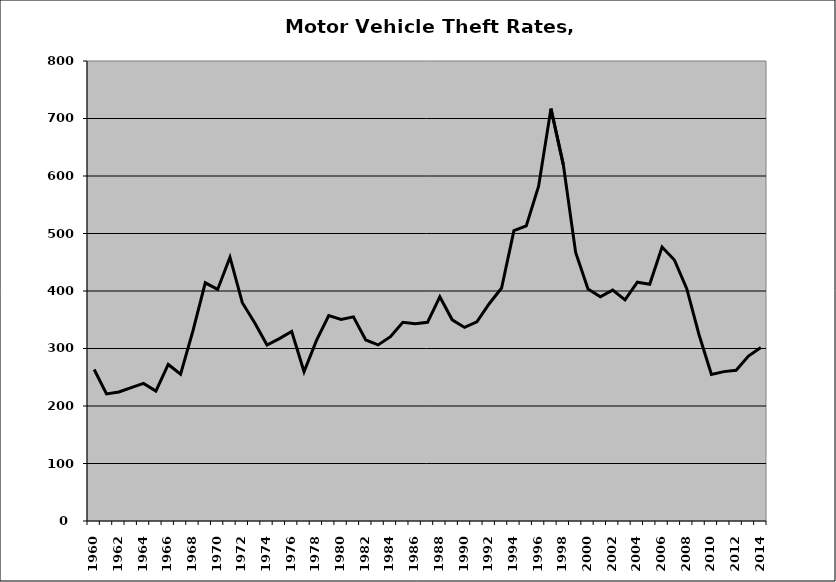
| Category | Motor Vehicle |
|---|---|
| 1960.0 | 263.401 |
| 1961.0 | 220.956 |
| 1962.0 | 224.412 |
| 1963.0 | 232.024 |
| 1964.0 | 239.385 |
| 1965.0 | 225.948 |
| 1966.0 | 272.211 |
| 1967.0 | 255.234 |
| 1968.0 | 330.739 |
| 1969.0 | 414.185 |
| 1970.0 | 402.756 |
| 1971.0 | 458.738 |
| 1972.0 | 379.624 |
| 1973.0 | 344.937 |
| 1974.0 | 306.061 |
| 1975.0 | 317.175 |
| 1976.0 | 329.538 |
| 1977.0 | 259.496 |
| 1978.0 | 313.779 |
| 1979.0 | 357.212 |
| 1980.0 | 350.605 |
| 1981.0 | 355.087 |
| 1982.0 | 314.864 |
| 1983.0 | 306.29 |
| 1984.0 | 320.506 |
| 1985.0 | 345.724 |
| 1986.0 | 343.272 |
| 1987.0 | 345.533 |
| 1988.0 | 389.934 |
| 1989.0 | 349.869 |
| 1990.0 | 336.684 |
| 1991.0 | 346.318 |
| 1992.0 | 377.862 |
| 1993.0 | 405.136 |
| 1994.0 | 504.837 |
| 1995.0 | 513.175 |
| 1996.0 | 582.195 |
| 1997.0 | 717.168 |
| 1998.0 | 619.862 |
| 1999.0 | 467.053 |
| 2000.0 | 403.563 |
| 2001.0 | 389.801 |
| 2002.0 | 401.556 |
| 2003.0 | 384.549 |
| 2004.0 | 415.238 |
| 2005.0 | 411.685 |
| 2006.0 | 476.466 |
| 2007.0 | 453.928 |
| 2008.0 | 403.974 |
| 2009.0 | 323.536 |
| 2010.0 | 254.81 |
| 2011.0 | 259.781 |
| 2012.0 | 262.198 |
| 2013.0 | 286.742 |
| 2014.0 | 301.596 |